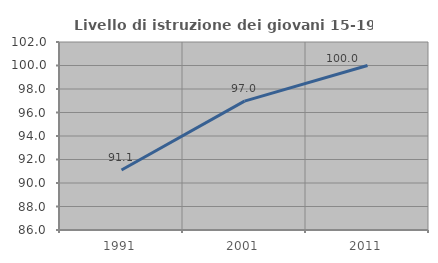
| Category | Livello di istruzione dei giovani 15-19 anni |
|---|---|
| 1991.0 | 91.111 |
| 2001.0 | 96.97 |
| 2011.0 | 100 |